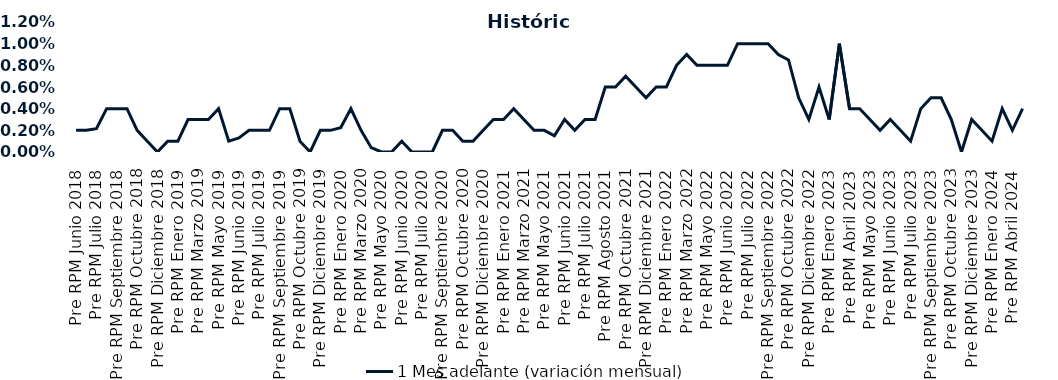
| Category | 1 Mes adelante (variación mensual) |
|---|---|
| Pre RPM Junio 2018 | 0.002 |
| Post RPM Junio 2018 | 0.002 |
| Pre RPM Julio 2018 | 0.002 |
| Post RPM Julio 2018 | 0.004 |
| Pre RPM Septiembre 2018 | 0.004 |
| Post RPM Septiembre 2018 | 0.004 |
| Pre RPM Octubre 2018 | 0.002 |
| Post RPM Octubre 2018 | 0.001 |
| Pre RPM Diciembre 2018 | 0 |
| Post RPM Diciembre 2018 | 0.001 |
| Pre RPM Enero 2019 | 0.001 |
| Post RPM Enero 2019 | 0.003 |
| Pre RPM Marzo 2019 | 0.003 |
| Post RPM Marzo 2019 | 0.003 |
| Pre RPM Mayo 2019 | 0.004 |
| Post RPM Mayo 2019 | 0.001 |
| Pre RPM Junio 2019 | 0.001 |
| Post RPM Junio 2019 | 0.002 |
| Pre RPM Julio 2019 | 0.002 |
| Post RPM Julio 2019 | 0.002 |
| Pre RPM Septiembre 2019 | 0.004 |
| Post RPM Septiembre 2019 | 0.004 |
| Pre RPM Octubre 2019 | 0.001 |
| Post RPM Octubre 2019 | 0 |
| Pre RPM Diciembre 2019 | 0.002 |
| Post RPM Diciembre 2019 | 0.002 |
| Pre RPM Enero 2020 | 0.002 |
| Post RPM Enero 2020 | 0.004 |
| Pre RPM Marzo 2020 | 0.002 |
| Post RPM Marzo 2020 | 0 |
| Pre RPM Mayo 2020 | 0 |
| Post RPM Mayo 2020 | 0 |
| Pre RPM Junio 2020 | 0.001 |
| Post RPM Junio 2020 | 0 |
| Pre RPM Julio 2020 | 0 |
| Post RPM Julio 2020 | 0 |
| Pre RPM Septiembre 2020 | 0.002 |
| Post RPM Septiembre 2020 | 0.002 |
| Pre RPM Octubre 2020 | 0.001 |
| Post RPM Octubre 2020 | 0.001 |
| Pre RPM Diciembre 2020 | 0.002 |
| Post RPM Diciembre 2020 | 0.003 |
| Pre RPM Enero 2021 | 0.003 |
| Post RPM Enero 2021 | 0.004 |
| Pre RPM Marzo 2021 | 0.003 |
| Post RPM Marzo 2021 | 0.002 |
| Pre RPM Mayo 2021 | 0.002 |
| Post RPM Mayo 2021 | 0.002 |
| Pre RPM Junio 2021 | 0.003 |
| Post RPM Junio 2021 | 0.002 |
| Pre RPM Julio 2021 | 0.003 |
| Post RPM Julio 2021 | 0.003 |
| Pre RPM Agosto 2021 | 0.006 |
| Post RPM Agosto 2021 | 0.006 |
| Pre RPM Octubre 2021 | 0.007 |
| Post RPM Octubre 2021 | 0.006 |
| Pre RPM Diciembre 2021 | 0.005 |
| Post RPM Diciembre 2021 | 0.006 |
| Pre RPM Enero 2022 | 0.006 |
| Post RPM Enero 2022 | 0.008 |
| Pre RPM Marzo 2022 | 0.009 |
| Post RPM Marzo 2022 | 0.008 |
| Pre RPM Mayo 2022 | 0.008 |
| Post RPM Mayo 2022 | 0.008 |
| Pre RPM Junio 2022 | 0.008 |
| Post RPM Junio 2022 | 0.01 |
| Pre RPM Julio 2022 | 0.01 |
| Post RPM Julio 2022 | 0.01 |
| Pre RPM Septiembre 2022 | 0.01 |
| Post RPM Septiembre 2022 | 0.009 |
| Pre RPM Octubre 2022 | 0.008 |
| Post RPM Octubre 2022 | 0.005 |
| Pre RPM Diciembre 2022 | 0.003 |
| Post RPM Diciembre 2022 | 0.006 |
| Pre RPM Enero 2023 | 0.003 |
| Post RPM Enero 2023 | 0.01 |
| Pre RPM Abril 2023 | 0.004 |
| Post RPM Abril 2023 | 0.004 |
| Pre RPM Mayo 2023 | 0.003 |
| Post RPM Mayo 2023 | 0.002 |
| Pre RPM Junio 2023 | 0.003 |
| Post RPM Junio 2023 | 0.002 |
| Pre RPM Julio 2023 | 0.001 |
| Post RPM Julio 2023 | 0.004 |
| Pre RPM Septiembre 2023 | 0.005 |
| Post RPM Septiembre 2023 | 0.005 |
| Pre RPM Octubre 2023 | 0.003 |
| Post RPM Octubre 2023 | 0 |
| Pre RPM Diciembre 2023 | 0.003 |
| Post RPM Diciembre 2023 | 0.002 |
| Pre RPM Enero 2024 | 0.001 |
| Post RPM Enero 2024 | 0.004 |
| Pre RPM Abril 2024 | 0.002 |
| Post RPM Abril 2024 | 0.004 |